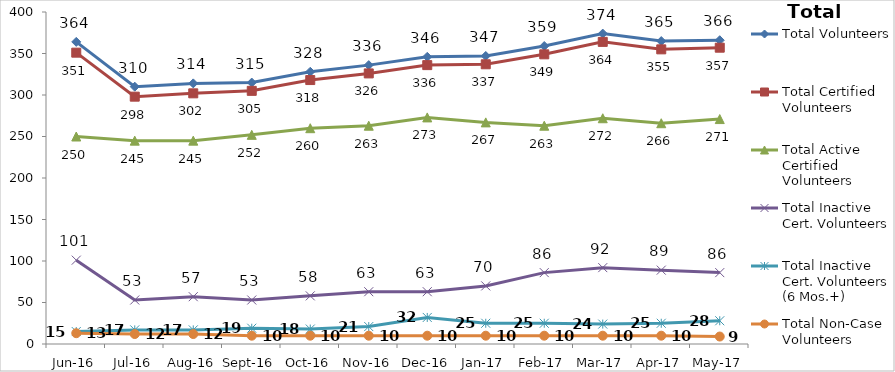
| Category | Total Volunteers | Total Certified Volunteers | Total Active Certified Volunteers | Total Inactive Cert. Volunteers | Total Inactive Cert. Volunteers (6 Mos.+) | Total Non-Case Volunteers |
|---|---|---|---|---|---|---|
| Jun-16 | 364 | 351 | 250 | 101 | 15 | 13 |
| Jul-16 | 310 | 298 | 245 | 53 | 17 | 12 |
| Aug-16 | 314 | 302 | 245 | 57 | 17 | 12 |
| Sep-16 | 315 | 305 | 252 | 53 | 19 | 10 |
| Oct-16 | 328 | 318 | 260 | 58 | 18 | 10 |
| Nov-16 | 336 | 326 | 263 | 63 | 21 | 10 |
| Dec-16 | 346 | 336 | 273 | 63 | 32 | 10 |
| Jan-17 | 347 | 337 | 267 | 70 | 25 | 10 |
| Feb-17 | 359 | 349 | 263 | 86 | 25 | 10 |
| Mar-17 | 374 | 364 | 272 | 92 | 24 | 10 |
| Apr-17 | 365 | 355 | 266 | 89 | 25 | 10 |
| May-17 | 366 | 357 | 271 | 86 | 28 | 9 |